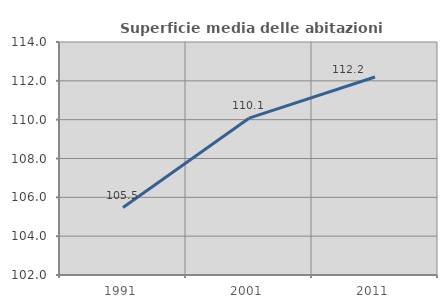
| Category | Superficie media delle abitazioni occupate |
|---|---|
| 1991.0 | 105.475 |
| 2001.0 | 110.078 |
| 2011.0 | 112.197 |